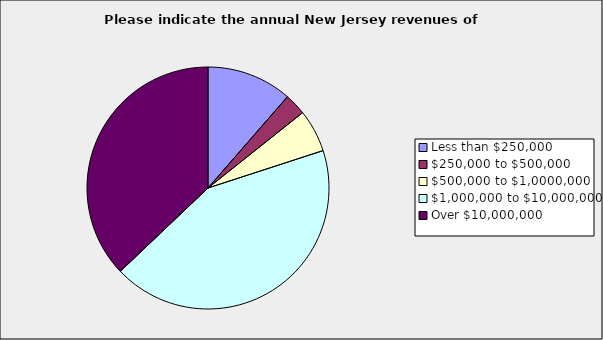
| Category | Series 0 |
|---|---|
| Less than $250,000 | 0.114 |
| $250,000 to $500,000 | 0.029 |
| $500,000 to $1,0000,000 | 0.057 |
| $1,000,000 to $10,000,000 | 0.429 |
| Over $10,000,000 | 0.371 |